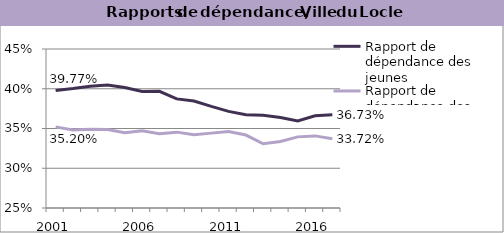
| Category | Rapport de dépendance des jeunes | Rapport de dépendance des personnes âgées |
|---|---|---|
| 2001.0 | 0.398 | 0.352 |
| 2002.0 | 0.4 | 0.348 |
| 2003.0 | 0.403 | 0.349 |
| 2004.0 | 0.405 | 0.349 |
| 2005.0 | 0.402 | 0.345 |
| 2006.0 | 0.397 | 0.347 |
| 2007.0 | 0.397 | 0.343 |
| 2008.0 | 0.387 | 0.345 |
| 2009.0 | 0.385 | 0.342 |
| 2010.0 | 0.378 | 0.344 |
| 2011.0 | 0.372 | 0.346 |
| 2012.0 | 0.367 | 0.342 |
| 2013.0 | 0.367 | 0.331 |
| 2014.0 | 0.364 | 0.334 |
| 2015.0 | 0.359 | 0.339 |
| 2016.0 | 0.366 | 0.341 |
| 2017.0 | 0.367 | 0.337 |